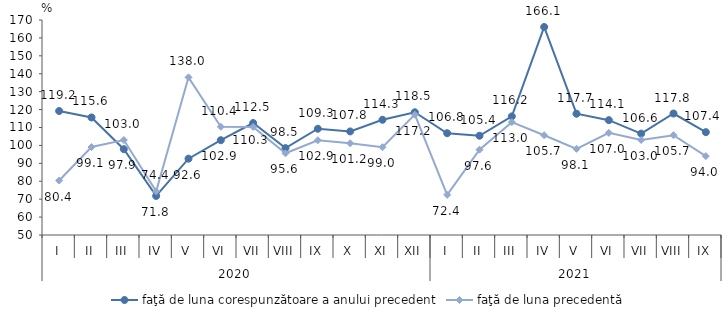
| Category | faţă de luna corespunzătoare a anului precedent | faţă de luna precedentă   |
|---|---|---|
| 0 | 119.2 | 80.4 |
| 1 | 115.6 | 99.1 |
| 2 | 97.9 | 103 |
| 3 | 71.8 | 74.4 |
| 4 | 92.6 | 138 |
| 5 | 102.9 | 110.4 |
| 6 | 112.5 | 110.3 |
| 7 | 98.5 | 95.6 |
| 8 | 109.3 | 102.9 |
| 9 | 107.8 | 101.2 |
| 10 | 114.3 | 99 |
| 11 | 118.5 | 117.2 |
| 12 | 106.8 | 72.4 |
| 13 | 105.4 | 97.6 |
| 14 | 116.2 | 113 |
| 15 | 166.1 | 105.7 |
| 16 | 117.7 | 98.1 |
| 17 | 114.1 | 107 |
| 18 | 106.6 | 103 |
| 19 | 117.8 | 105.7 |
| 20 | 107.4 | 94 |